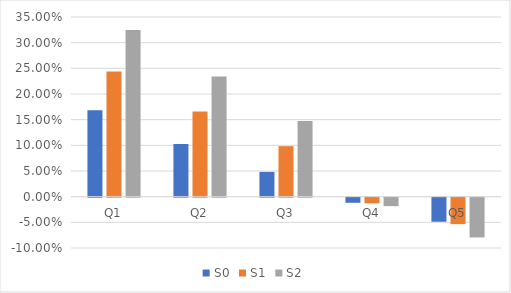
| Category | S0 | S1 | S2 |
|---|---|---|---|
|  Q1  | 0.169 | 0.244 | 0.325 |
| Q2 | 0.103 | 0.166 | 0.234 |
| Q3 | 0.048 | 0.098 | 0.148 |
| Q4 | -0.01 | -0.011 | -0.017 |
| Q5 | -0.047 | -0.052 | -0.077 |